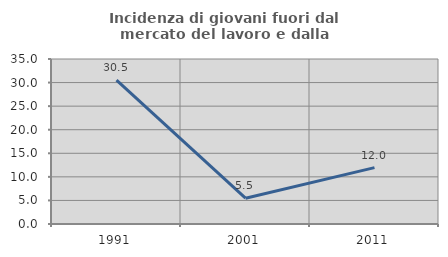
| Category | Incidenza di giovani fuori dal mercato del lavoro e dalla formazione  |
|---|---|
| 1991.0 | 30.526 |
| 2001.0 | 5.479 |
| 2011.0 | 11.957 |